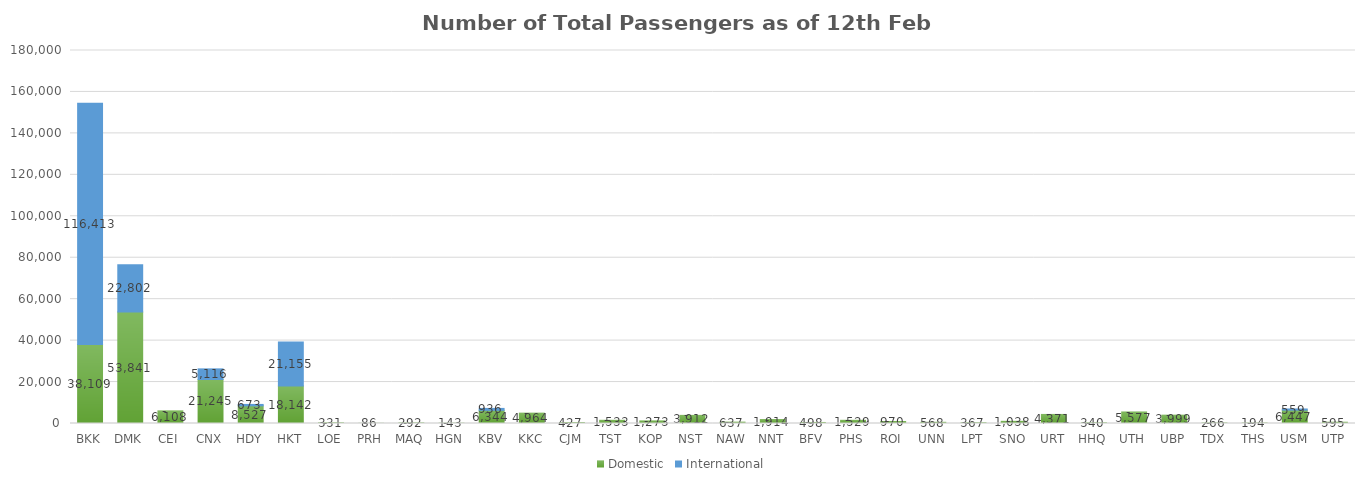
| Category | Domestic | International |
|---|---|---|
| BKK | 38109 | 116413 |
| DMK | 53841 | 22802 |
| CEI | 6108 | 0 |
| CNX | 21245 | 5116 |
| HDY | 8527 | 673 |
| HKT | 18142 | 21155 |
| LOE | 331 | 0 |
| PRH | 86 | 0 |
| MAQ | 292 | 0 |
| HGN | 143 | 0 |
| KBV | 6344 | 936 |
| KKC | 4964 | 0 |
| CJM | 427 | 0 |
| TST | 1533 | 0 |
| KOP | 1273 | 0 |
| NST | 3912 | 0 |
| NAW | 637 | 0 |
| NNT | 1914 | 0 |
| BFV | 498 | 0 |
| PHS | 1529 | 0 |
| ROI | 970 | 0 |
| UNN | 568 | 0 |
| LPT | 367 | 0 |
| SNO | 1038 | 0 |
| URT | 4371 | 0 |
| HHQ | 340 | 0 |
| UTH | 5577 | 0 |
| UBP | 3999 | 0 |
| TDX | 266 | 0 |
| THS | 194 | 0 |
| USM | 6447 | 559 |
| UTP | 595 | 0 |